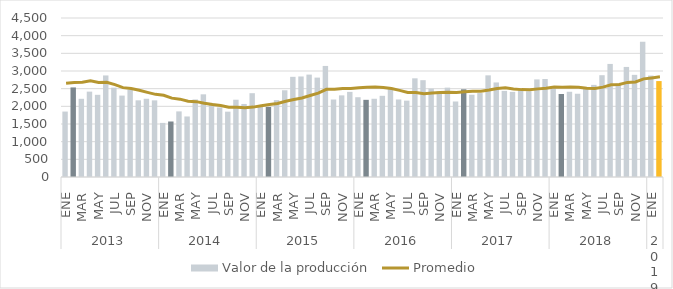
| Category | Valor de la producción |
|---|---|
| 0 | 1852 |
| 1 | 2535 |
| 2 | 2213 |
| 3 | 2416 |
| 4 | 2326 |
| 5 | 2874 |
| 6 | 2528 |
| 7 | 2304 |
| 8 | 2473 |
| 9 | 2170 |
| 10 | 2214 |
| 11 | 2169 |
| 12 | 1531 |
| 13 | 1571 |
| 14 | 1857 |
| 15 | 1713 |
| 16 | 2194 |
| 17 | 2340 |
| 18 | 2089 |
| 19 | 1969 |
| 20 | 1849 |
| 21 | 2187 |
| 22 | 2067 |
| 23 | 2372 |
| 24 | 2022 |
| 25 | 1981 |
| 26 | 2176 |
| 27 | 2455 |
| 28 | 2835 |
| 29 | 2845 |
| 30 | 2898 |
| 31 | 2813 |
| 32 | 3143 |
| 33 | 2193 |
| 34 | 2310 |
| 35 | 2409 |
| 36 | 2258 |
| 37 | 2184 |
| 38 | 2214 |
| 39 | 2298 |
| 40 | 2499 |
| 41 | 2194 |
| 42 | 2161 |
| 43 | 2793 |
| 44 | 2740 |
| 45 | 2500 |
| 46 | 2427 |
| 47 | 2529 |
| 48 | 2137 |
| 49 | 2482 |
| 50 | 2328 |
| 51 | 2375 |
| 52 | 2877 |
| 53 | 2676 |
| 54 | 2437 |
| 55 | 2409 |
| 56 | 2495 |
| 57 | 2427 |
| 58 | 2762 |
| 59 | 2774 |
| 60 | 2544 |
| 61 | 2349 |
| 62 | 2412 |
| 63 | 2356 |
| 64 | 2497 |
| 65 | 2607 |
| 66 | 2881 |
| 67 | 3200 |
| 68 | 2646 |
| 69 | 3115 |
| 70 | 2891 |
| 71 | 3828 |
| 72 | 2871 |
| 73 | 2715 |